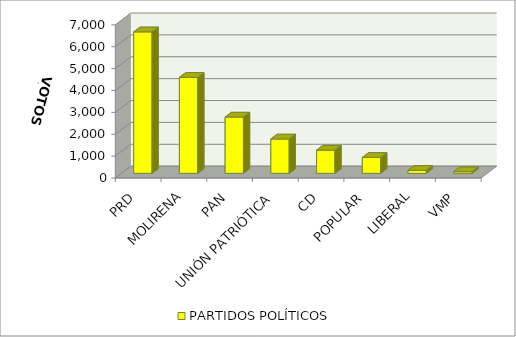
| Category | PARTIDOS POLÍTICOS |
|---|---|
| PRD | 6466 |
| MOLIRENA | 4388 |
| PAN | 2572 |
| UNIÓN PATRIÓTICA | 1570 |
| CD | 1062 |
| POPULAR | 729 |
| LIBERAL | 137 |
| VMP | 77 |